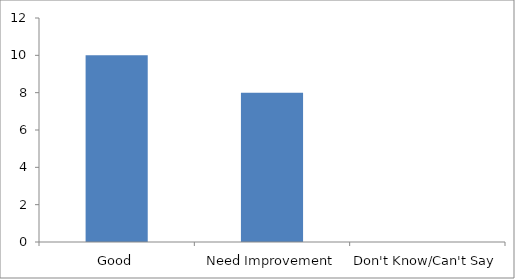
| Category | How would you rate the following aspects of the social entrepreneurship program of PVTC? v.The  internal organizational support  |
|---|---|
| Good | 10 |
| Need Improvement | 8 |
| Don't Know/Can't Say | 0 |